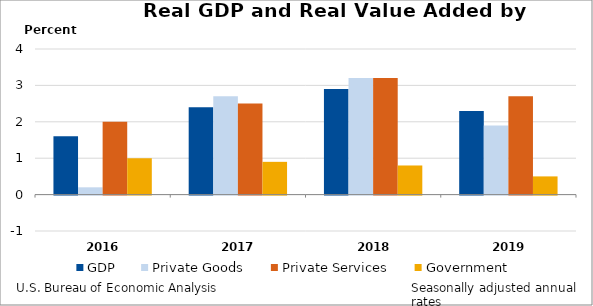
| Category | GDP | Private Goods | Private Services | Government |
|---|---|---|---|---|
| 2016.0 | 1.6 | 0.2 | 2 | 1 |
| 2017.0 | 2.4 | 2.7 | 2.5 | 0.9 |
| 2018.0 | 2.9 | 3.2 | 3.2 | 0.8 |
| 2019.0 | 2.3 | 1.9 | 2.7 | 0.5 |